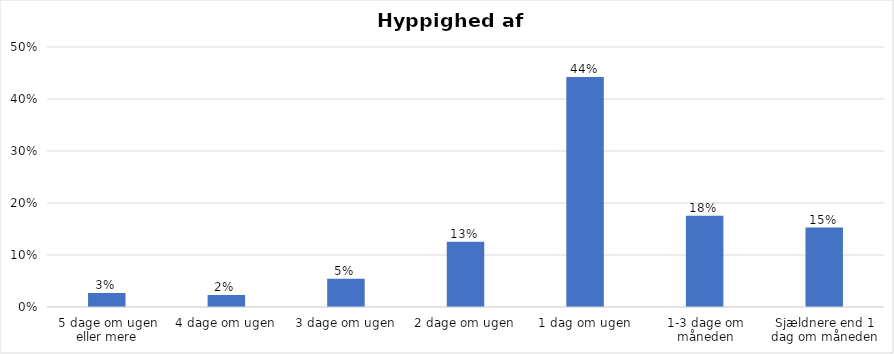
| Category | % |
|---|---|
| 5 dage om ugen eller mere | 0.027 |
| 4 dage om ugen | 0.023 |
| 3 dage om ugen | 0.054 |
| 2 dage om ugen | 0.126 |
| 1 dag om ugen | 0.442 |
| 1-3 dage om måneden | 0.175 |
| Sjældnere end 1 dag om måneden | 0.153 |